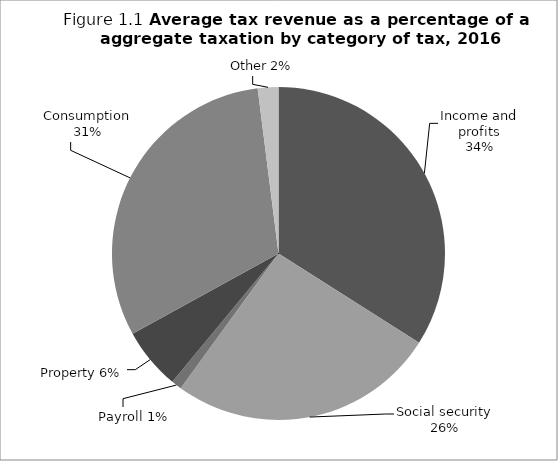
| Category | Series 0 |
|---|---|
| Income and profits | 34 |
| Social security | 26 |
| Payroll | 1 |
| Property | 6 |
| Consumption | 31 |
| Other | 2 |